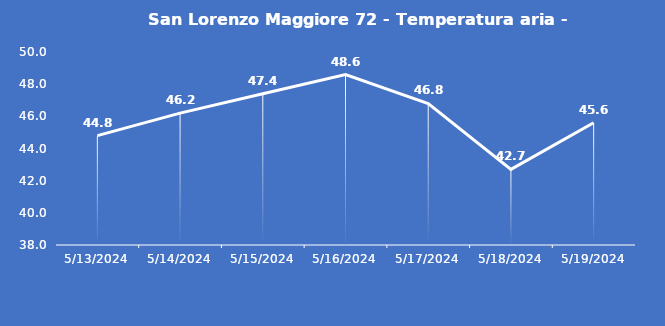
| Category | San Lorenzo Maggiore 72 - Temperatura aria - Grezzo (°C) |
|---|---|
| 5/13/24 | 44.8 |
| 5/14/24 | 46.2 |
| 5/15/24 | 47.4 |
| 5/16/24 | 48.6 |
| 5/17/24 | 46.8 |
| 5/18/24 | 42.7 |
| 5/19/24 | 45.6 |